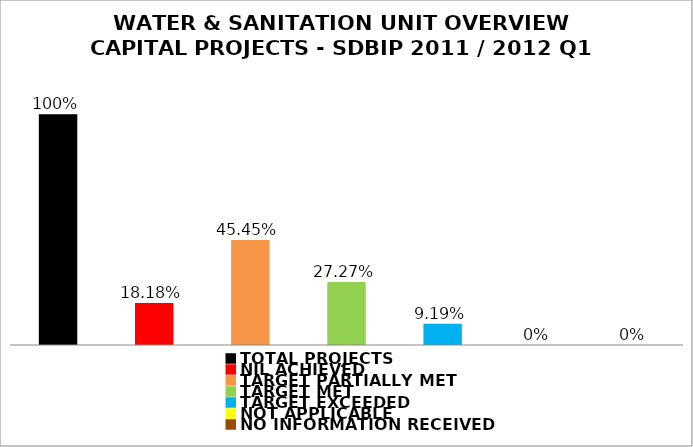
| Category | Series 1 |
|---|---|
| TOTAL PROJECTS | 1 |
| NIL ACHIEVED | 0.182 |
| TARGET PARTIALLY MET | 0.454 |
| TARGET MET | 0.273 |
| TARGET EXCEEDED | 0.092 |
| NOT APPLICABLE | 0 |
| NO INFORMATION RECEIVED | 0 |